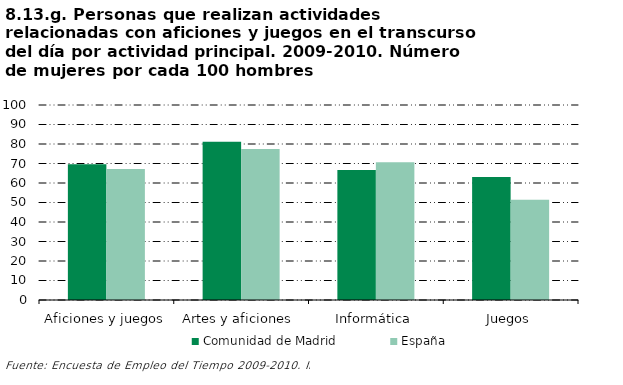
| Category | Comunidad de Madrid | España |
|---|---|---|
| Aficiones y juegos | 69.673 | 67.135 |
| Artes y aficiones  | 81.112 | 77.419 |
| Informática | 66.686 | 70.588 |
| Juegos | 63.031 | 51.449 |